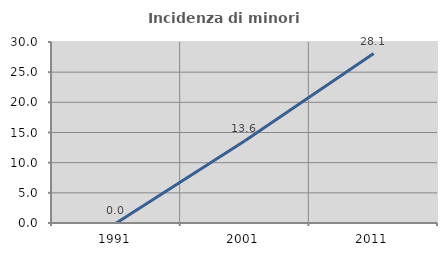
| Category | Incidenza di minori stranieri |
|---|---|
| 1991.0 | 0 |
| 2001.0 | 13.636 |
| 2011.0 | 28.09 |